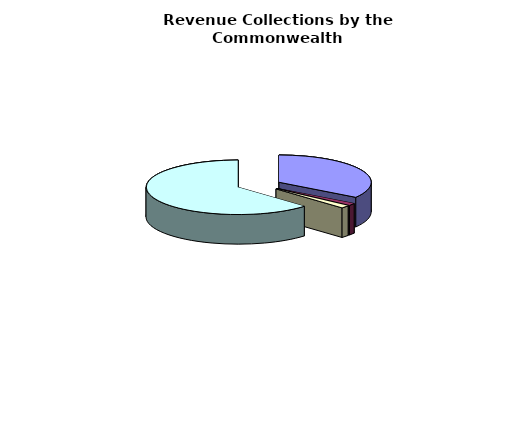
| Category | Series 0 |
|---|---|
| General Fund | 20943678000 |
| Non-General Fund | 848413000 |
| General Fund | 959893000 |
| Non-General Fund | 38271170000 |